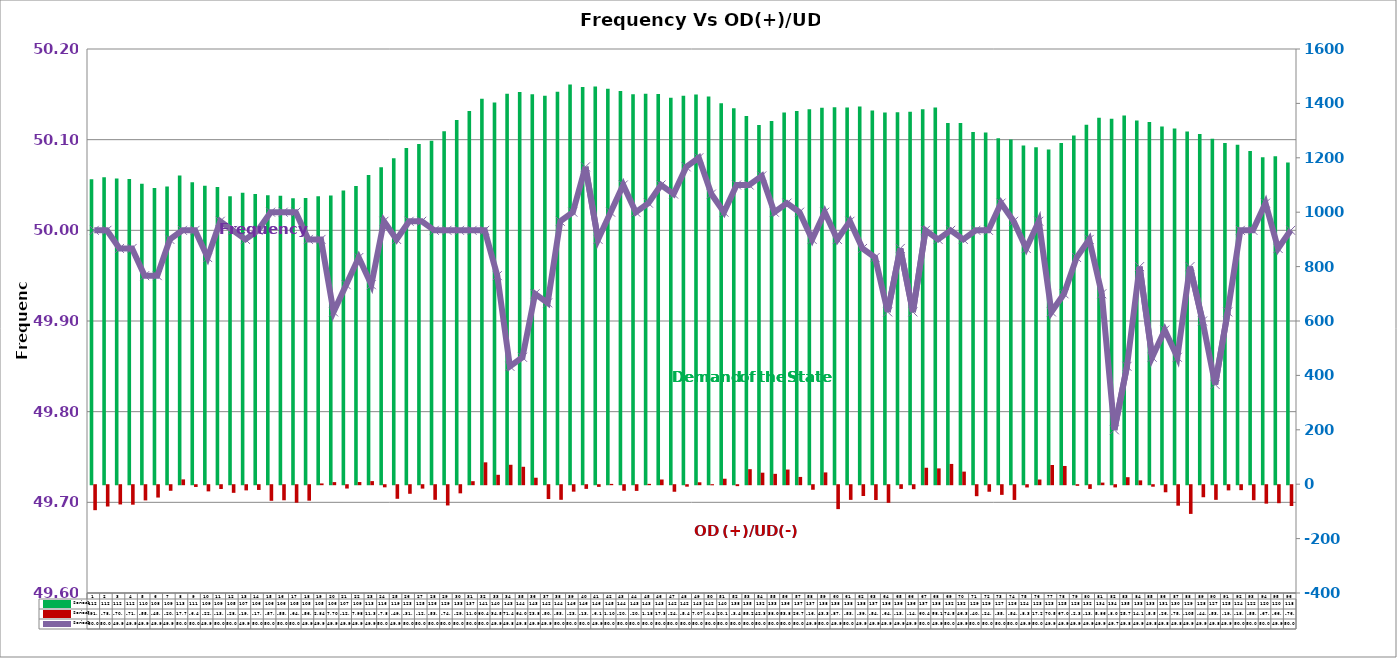
| Category | Series 2 | Series 4 |
|---|---|---|
| 0 | 1120.7 | -91.83 |
| 1 | 1128.12 | -78.31 |
| 2 | 1123.62 | -70.8 |
| 3 | 1122.5 | -71.71 |
| 4 | 1104.37 | -55.86 |
| 5 | 1088.93 | -45.41 |
| 6 | 1094.86 | -20.49 |
| 7 | 1135.02 | 17.7 |
| 8 | 1109.98 | -6.49 |
| 9 | 1097.58 | -22.69 |
| 10 | 1092.28 | -13.92 |
| 11 | 1058.55 | -28.07 |
| 12 | 1071.11 | -19.05 |
| 13 | 1067.17 | -17.45 |
| 14 | 1062.33 | -57.34 |
| 15 | 1060.22 | -55.41 |
| 16 | 1050.95 | -64.27 |
| 17 | 1052.09 | -56.92 |
| 18 | 1058.53 | 2.84 |
| 19 | 1061.82 | 7.7 |
| 20 | 1079.49 | -12.25 |
| 21 | 1095.97 | 7.98 |
| 22 | 1137.09 | 11.35 |
| 23 | 1164.82 | -7.82 |
| 24 | 1198.31 | -49.96 |
| 25 | 1235.67 | -31.6 |
| 26 | 1251.1 | -12.56 |
| 27 | 1262.51 | -53.7 |
| 28 | 1297.9 | -74.52 |
| 29 | 1339.22 | -29.93 |
| 30 | 1372.35 | 11.08 |
| 31 | 1416.78 | 80.41 |
| 32 | 1402.96 | 34.57 |
| 33 | 1435.23 | 71.42 |
| 34 | 1441.65 | 64.04 |
| 35 | 1433.43 | 23.83 |
| 36 | 1427.99 | -50.95 |
| 37 | 1443.24 | -53.68 |
| 38 | 1469.08 | -23.75 |
| 39 | 1460.16 | -13.52 |
| 40 | 1461.82 | -6.17 |
| 41 | 1453.73 | 1.1 |
| 42 | 1446.02 | -20.35 |
| 43 | 1434.03 | -20.92 |
| 44 | 1435.55 | 1.18 |
| 45 | 1434.96 | 17.3 |
| 46 | 1420.6 | -24.08 |
| 47 | 1428.41 | -5.43 |
| 48 | 1432.28 | 7.07 |
| 49 | 1425.6 | -0.44 |
| 50 | 1400.8 | 20.11 |
| 51 | 1382.53 | -3.45 |
| 52 | 1353.23 | 55.22 |
| 53 | 1320.5 | 42.35 |
| 54 | 1335.2 | 38.09 |
| 55 | 1366.57 | 53.89 |
| 56 | 1372.18 | 26.72 |
| 57 | 1378.4 | -16.75 |
| 58 | 1384.29 | 43.35 |
| 59 | 1385.92 | -87.96 |
| 60 | 1384.8 | -53.97 |
| 61 | 1389.06 | -39.71 |
| 62 | 1374.35 | -54.53 |
| 63 | 1366.69 | -64.81 |
| 64 | 1367.4 | -13.64 |
| 65 | 1369.1 | -14.7 |
| 66 | 1378.1 | 60.48 |
| 67 | 1384.65 | 58.13 |
| 68 | 1328.37 | 74.5 |
| 69 | 1327.69 | 46.3 |
| 70 | 1295.16 | -40.38 |
| 71 | 1292.84 | -24.04 |
| 72 | 1272.14 | -35.54 |
| 73 | 1267.54 | -54.24 |
| 74 | 1245.39 | -8.33 |
| 75 | 1238.95 | 17.22 |
| 76 | 1230.66 | 70.57 |
| 77 | 1254.43 | 67.03 |
| 78 | 1282.33 | -2.36 |
| 79 | 1321.78 | -13.65 |
| 80 | 1346.82 | 5.86 |
| 81 | 1343.51 | -8.09 |
| 82 | 1355.64 | 25.74 |
| 83 | 1337.57 | 14.1 |
| 84 | 1331.72 | -5.53 |
| 85 | 1314.81 | -26.05 |
| 86 | 1307.62 | -75.37 |
| 87 | 1296.87 | -105.51 |
| 88 | 1287.44 | -44.26 |
| 89 | 1270.34 | -53.85 |
| 90 | 1254.74 | -19.1 |
| 91 | 1247.92 | -18.23 |
| 92 | 1225.32 | -55.16 |
| 93 | 1202.4 | -67.81 |
| 94 | 1206.04 | -66.23 |
| 95 | 1182.71 | -76.4 |